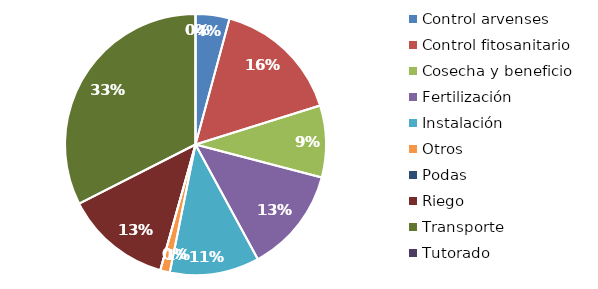
| Category | Valor |
|---|---|
| Control arvenses | 1582800 |
| Control fitosanitario | 6019670 |
| Cosecha y beneficio | 3352335.898 |
| Fertilización | 4897940 |
| Instalación | 4175589.268 |
| Otros | 450079.405 |
| Podas | 0 |
| Riego | 4957330 |
| Transporte | 12242298 |
| Tutorado | 0 |